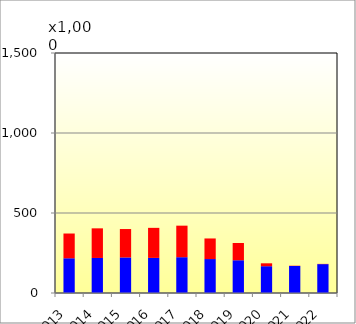
| Category | DOM | INT |
|---|---|---|
| 2013 | 217118 | 154650 |
| 2014 | 219024 | 185092 |
| 2015 | 222378 | 177386 |
| 2016 | 219460 | 187685 |
| 2017 | 223763 | 197074 |
| 2018 | 212152 | 128728 |
| 2019 | 204695 | 107972 |
| 2020 | 167485 | 18119 |
| 2021 | 168914 | 1732 |
| 2022 | 180450 | 1468 |